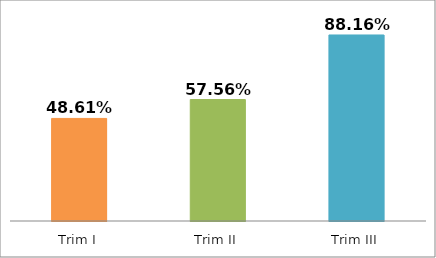
| Category | Series 0 |
|---|---|
| Trim I | 0.486 |
| Trim II | 0.576 |
| Trim III | 0.882 |